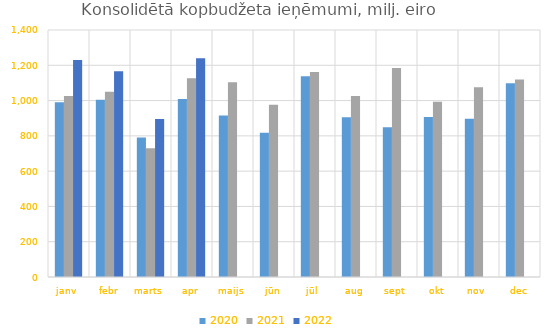
| Category | 2020 | 2021 | 2022 |
|---|---|---|---|
| janv | 990255.966 | 1025729.219 | 1230170.047 |
| febr | 1003986.803 | 1050032.948 | 1166379.907 |
| marts | 790973.859 | 729450.354 | 896198.796 |
| apr | 1008343.173 | 1125852.842 | 1240480.294 |
| maijs | 915661.348 | 1104155.322 | 0 |
| jūn | 817524.851 | 976600.628 | 0 |
| jūl | 1137278.065 | 1162632.002 | 0 |
| aug | 905597.447 | 1025720.022 | 0 |
| sept | 848822.405 | 1184851.081 | 0 |
| okt | 906227.444 | 993429.183 | 0 |
| nov | 896995.399 | 1074941.099 | 0 |
| dec | 1098839.178 | 1118858.021 | 0 |